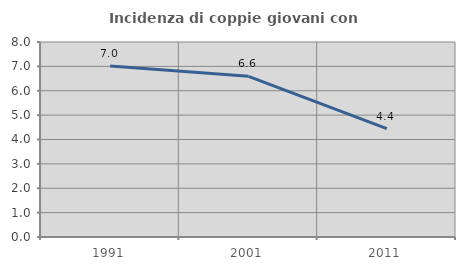
| Category | Incidenza di coppie giovani con figli |
|---|---|
| 1991.0 | 7.018 |
| 2001.0 | 6.593 |
| 2011.0 | 4.444 |